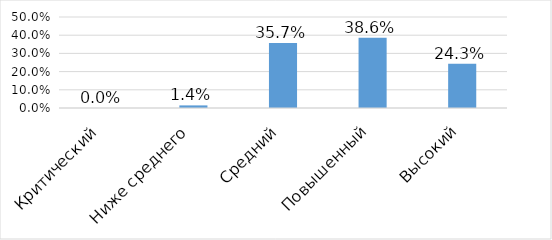
| Category | Series 0 |
|---|---|
| Критический | 0 |
| Ниже среднего | 0.014 |
| Средний | 0.357 |
| Повышенный | 0.386 |
| Высокий | 0.243 |